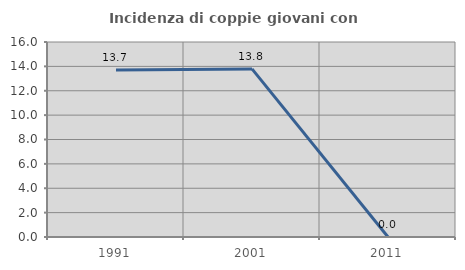
| Category | Incidenza di coppie giovani con figli |
|---|---|
| 1991.0 | 13.699 |
| 2001.0 | 13.793 |
| 2011.0 | 0 |